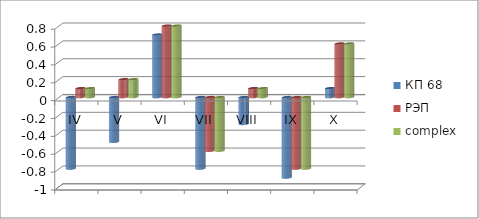
| Category | КП 68 | РЭП  | complex |
|---|---|---|---|
| IV | -0.8 | 0.1 | 0.1 |
| V | -0.5 | 0.2 | 0.2 |
| VI | 0.7 | 0.8 | 0.8 |
| VII | -0.8 | -0.6 | -0.6 |
| VIII | -0.3 | 0.1 | 0.1 |
| IX | -0.9 | -0.8 | -0.8 |
| X | 0.1 | 0.6 | 0.6 |